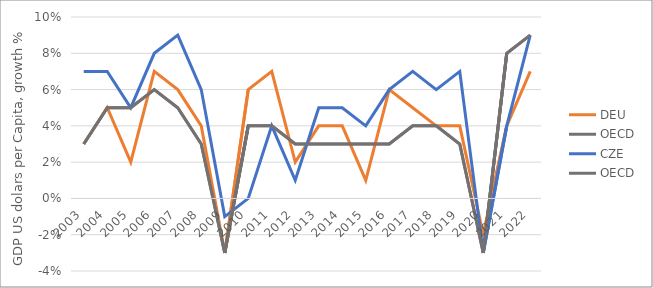
| Category | DEU | OECD | CZE |
|---|---|---|---|
| 2003.0 | 0.03 | 0.03 | 0.07 |
| 2004.0 | 0.05 | 0.05 | 0.07 |
| 2005.0 | 0.02 | 0.05 | 0.05 |
| 2006.0 | 0.07 | 0.06 | 0.08 |
| 2007.0 | 0.06 | 0.05 | 0.09 |
| 2008.0 | 0.04 | 0.03 | 0.06 |
| 2009.0 | -0.03 | -0.03 | -0.01 |
| 2010.0 | 0.06 | 0.04 | 0 |
| 2011.0 | 0.07 | 0.04 | 0.04 |
| 2012.0 | 0.02 | 0.03 | 0.01 |
| 2013.0 | 0.04 | 0.03 | 0.05 |
| 2014.0 | 0.04 | 0.03 | 0.05 |
| 2015.0 | 0.01 | 0.03 | 0.04 |
| 2016.0 | 0.06 | 0.03 | 0.06 |
| 2017.0 | 0.05 | 0.04 | 0.07 |
| 2018.0 | 0.04 | 0.04 | 0.06 |
| 2019.0 | 0.04 | 0.03 | 0.07 |
| 2020.0 | -0.02 | -0.03 | -0.03 |
| 2021.0 | 0.04 | 0.08 | 0.04 |
| 2022.0 | 0.07 | 0.09 | 0.09 |